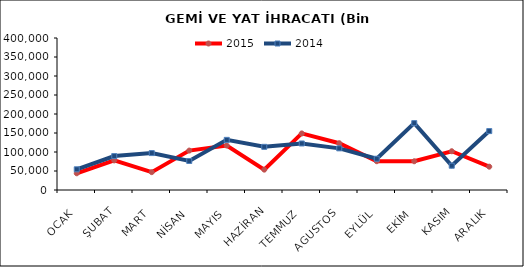
| Category | 2015 | 2014 |
|---|---|---|
| OCAK | 43975.631 | 54471.324 |
| ŞUBAT | 77870.874 | 89236.716 |
| MART | 46982.887 | 97135.555 |
| NİSAN | 103764.36 | 76354.088 |
| MAYIS | 117014.658 | 131933.468 |
| HAZİRAN | 53595.192 | 113595.982 |
| TEMMUZ | 148862.533 | 122441.119 |
| AGUSTOS | 123107.683 | 109592.971 |
| EYLÜL | 75751.284 | 82221.245 |
| EKİM | 75632.592 | 175946.589 |
| KASIM | 102000.234 | 63880.74 |
| ARALIK | 61359.294 | 155056.154 |